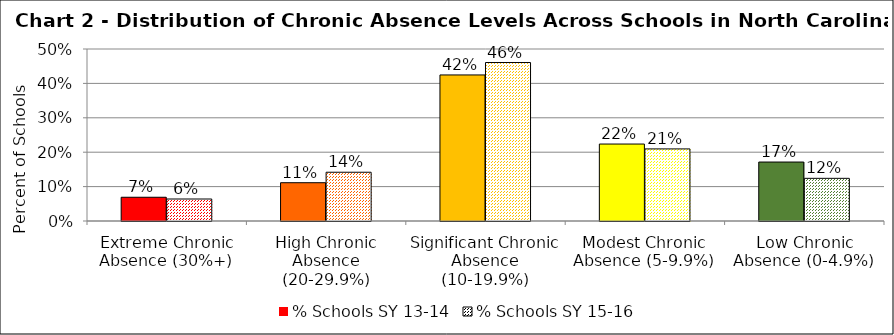
| Category | % Schools SY 13-14 | % Schools SY 15-16 |
|---|---|---|
| Extreme Chronic Absence (30%+) | 0.069 | 0.064 |
| High Chronic Absence (20-29.9%) | 0.111 | 0.142 |
| Significant Chronic Absence (10-19.9%) | 0.425 | 0.461 |
| Modest Chronic Absence (5-9.9%) | 0.224 | 0.21 |
| Low Chronic Absence (0-4.9%) | 0.171 | 0.124 |